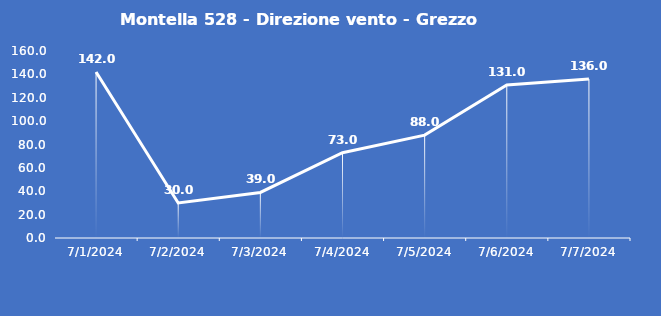
| Category | Montella 528 - Direzione vento - Grezzo (°N) |
|---|---|
| 7/1/24 | 142 |
| 7/2/24 | 30 |
| 7/3/24 | 39 |
| 7/4/24 | 73 |
| 7/5/24 | 88 |
| 7/6/24 | 131 |
| 7/7/24 | 136 |